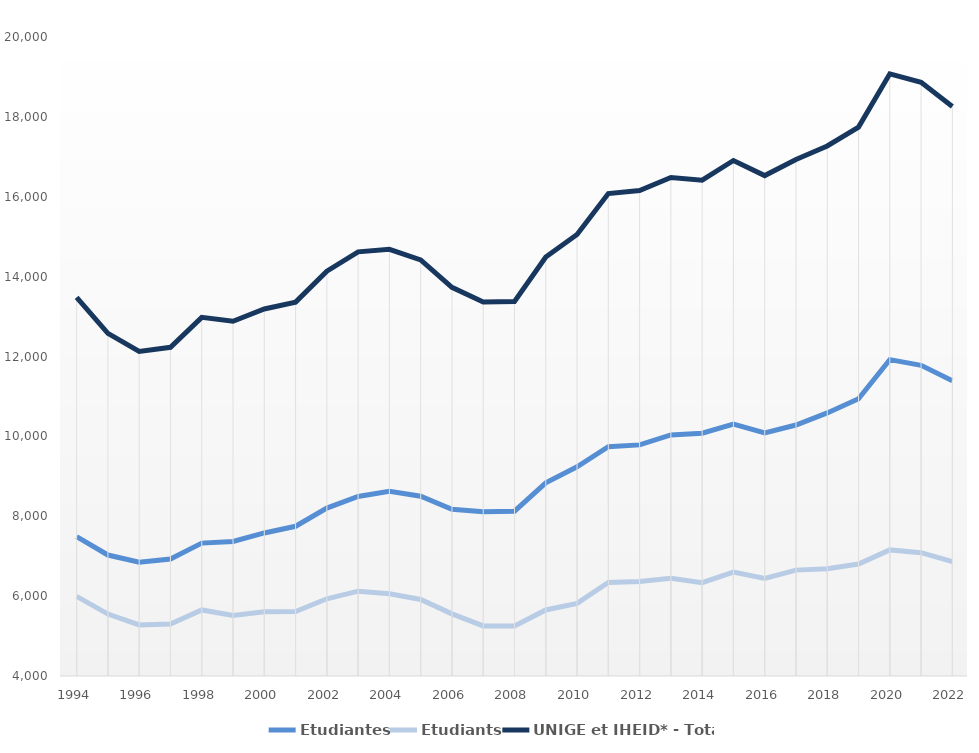
| Category | Etudiantes | Etudiants | UNIGE et IHEID* - Total |
|---|---|---|---|
| 1994 | 7490 | 5993 | 13483 |
| 1995 | 7029 | 5551 | 12580 |
| 1996 | 6847 | 5279 | 12126 |
| 1997 | 6928 | 5302 | 12230 |
| 1998 | 7327 | 5654 | 12981 |
| 1999 | 7369 | 5514 | 12883 |
| 2000 | 7582 | 5609 | 13191 |
| 2001 | 7749 | 5612 | 13361 |
| 2002 | 8205 | 5933 | 14138 |
| 2003 | 8496 | 6124 | 14620 |
| 2004 | 8628 | 6057 | 14685 |
| 2005 | 8501 | 5917 | 14418 |
| 2006 | 8176 | 5556 | 13732 |
| 2007 | 8110 | 5254 | 13364 |
| 2008 | 8126 | 5253 | 13379 |
| 2009 | 8836 | 5653 | 14489 |
| 2010 | 9238 | 5819 | 15057 |
| 2011 | 9740 | 6341 | 16081 |
| 2012 | 9787 | 6367 | 16154 |
| 2013 | 10037 | 6447 | 16484 |
| 2014 | 10078 | 6338 | 16416 |
| 2015 | 10308 | 6600 | 16908 |
| 2016 | 10088 | 6442 | 16530 |
| 2017 | 10284 | 6651 | 16935 |
| 2018 | 10587 | 6684 | 17271 |
| 2019 | 10940 | 6804 | 17744 |
| 2020 | 11921 | 7157 | 19078 |
| 2021 | 11778 | 7087 | 18865 |
| 2022 | 11395 | 6866 | 18261 |